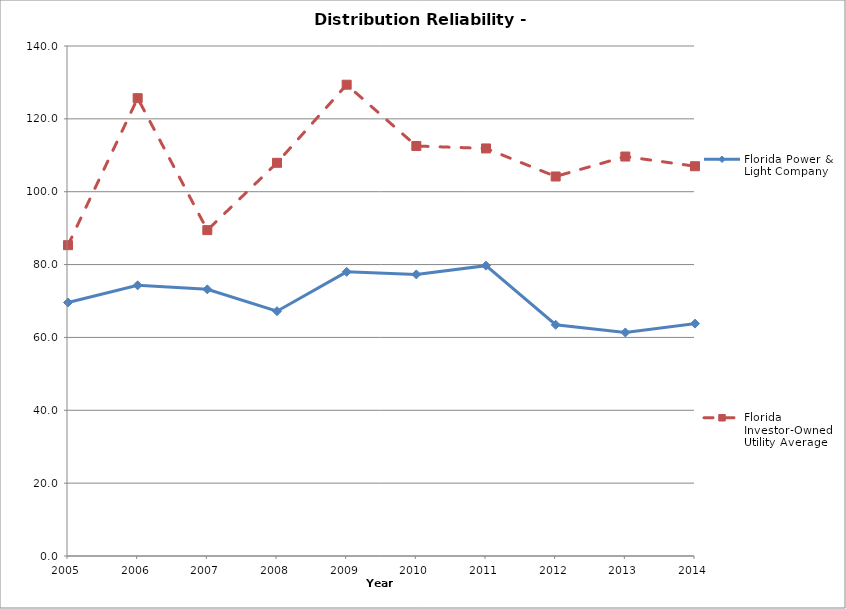
| Category | Florida Power & Light Company | Florida Investor-Owned Utility Average |
|---|---|---|
| 2005.0 | 69.6 | 85.325 |
| 2006.0 | 74.3 | 125.678 |
| 2007.0 | 73.2 | 89.452 |
| 2008.0 | 67.2 | 107.935 |
| 2009.0 | 78 | 129.375 |
| 2010.0 | 77.3 | 112.55 |
| 2011.0 | 79.7 | 111.878 |
| 2012.0 | 63.477 | 104.18 |
| 2013.0 | 61.37 | 109.655 |
| 2014.0 | 63.794 | 106.998 |